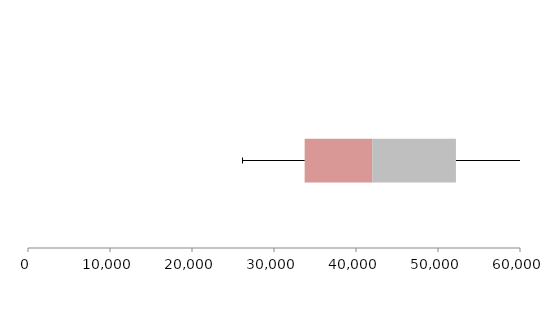
| Category | Series 1 | Series 2 | Series 3 |
|---|---|---|---|
| 0 | 33737.781 | 8237.23 | 10215.242 |